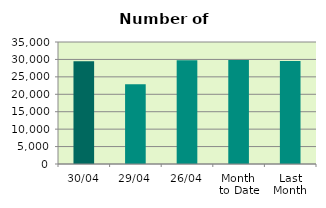
| Category | Series 0 |
|---|---|
| 30/04 | 29468 |
| 29/04 | 22880 |
| 26/04 | 29782 |
| Month 
to Date | 29833 |
| Last
Month | 29553.143 |